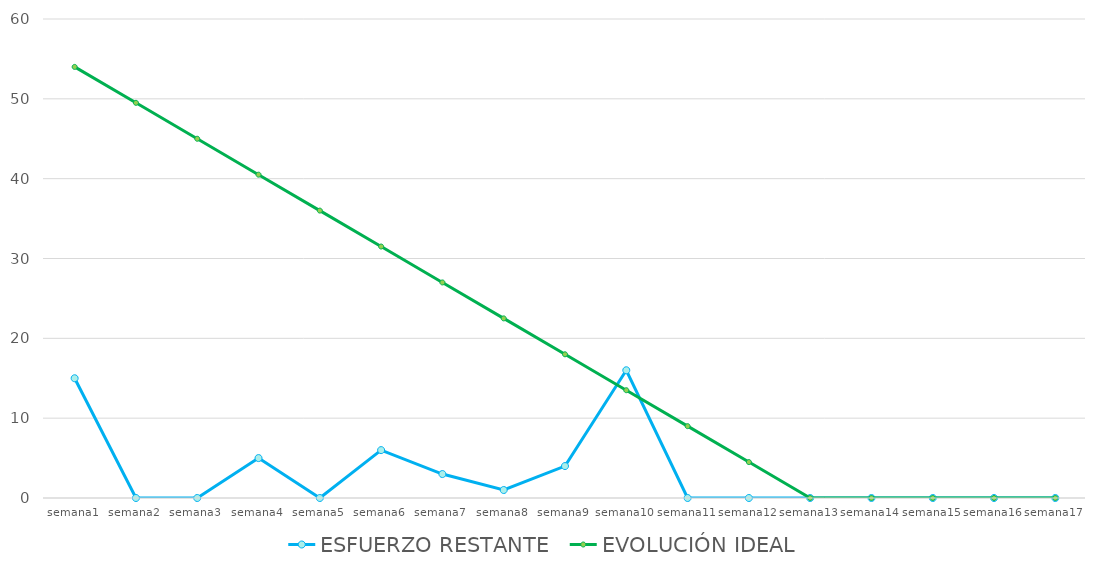
| Category | ESFUERZO RESTANTE | EVOLUCIÓN IDEAL |
|---|---|---|
| semana1 | 15 | 54 |
| semana2 | 0 | 49.5 |
| semana3 | 0 | 45 |
| semana4 | 5 | 40.5 |
| semana5 | 0 | 36 |
| semana6 | 6 | 31.5 |
| semana7 | 3 | 27 |
| semana8 | 1 | 22.5 |
| semana9 | 4 | 18 |
| semana10 | 16 | 13.5 |
| semana11 | 0 | 9 |
| semana12 | 0 | 4.5 |
| semana13 | 0 | 0 |
| semana14 | 0 | 0 |
| semana15 | 0 | 0 |
| semana16 | 0 | 0 |
| semana17 | 0 | 0 |